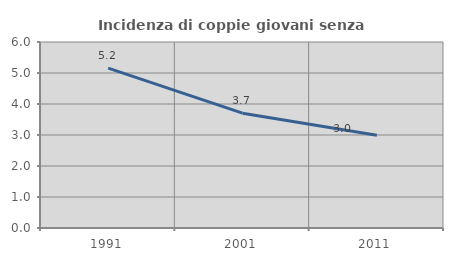
| Category | Incidenza di coppie giovani senza figli |
|---|---|
| 1991.0 | 5.159 |
| 2001.0 | 3.704 |
| 2011.0 | 2.991 |